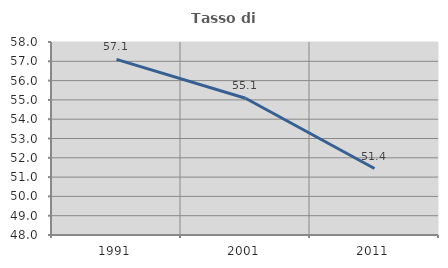
| Category | Tasso di occupazione   |
|---|---|
| 1991.0 | 57.1 |
| 2001.0 | 55.088 |
| 2011.0 | 51.443 |